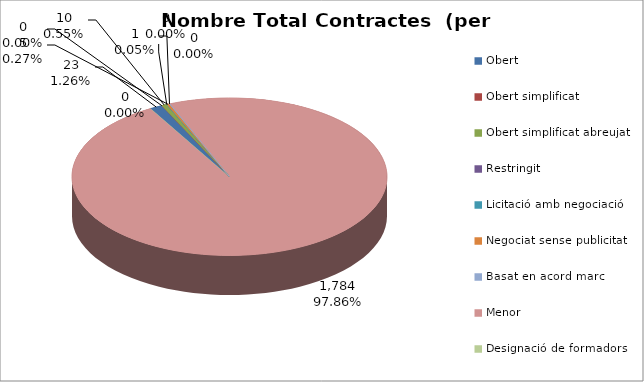
| Category | Nombre Total Contractes |
|---|---|
| Obert | 23 |
| Obert simplificat | 0 |
| Obert simplificat abreujat | 10 |
| Restringit | 0 |
| Licitació amb negociació | 0 |
| Negociat sense publicitat | 5 |
| Basat en acord marc | 1 |
| Menor | 1784 |
| Designació de formadors | 0 |